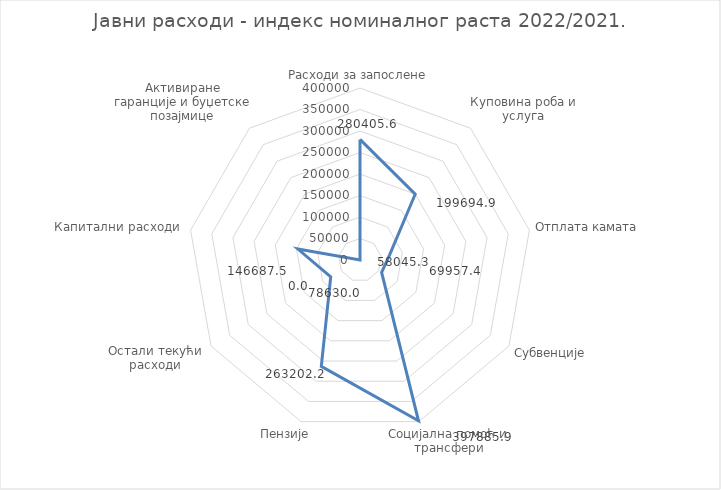
| Category | Series 0 |
|---|---|
| Расходи за запослене | 280405.583 |
| Куповина роба и услуга | 199694.948 |
| Отплата камата | 69957.425 |
| Субвенције | 58045.338 |
| Социјална помоћ и трансфери | 397885.881 |
| Пензије | 263202.18 |
| Остали текући расходи | 78629.959 |
| Капитални расходи | 146687.514 |
| Активиране гаранције и буџетске позајмице | 0 |